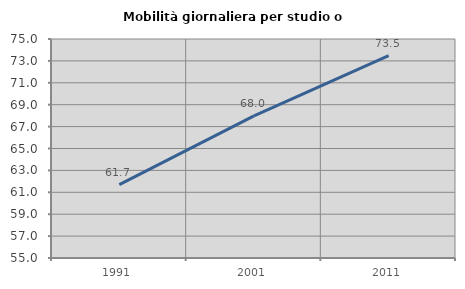
| Category | Mobilità giornaliera per studio o lavoro |
|---|---|
| 1991.0 | 61.703 |
| 2001.0 | 67.975 |
| 2011.0 | 73.488 |